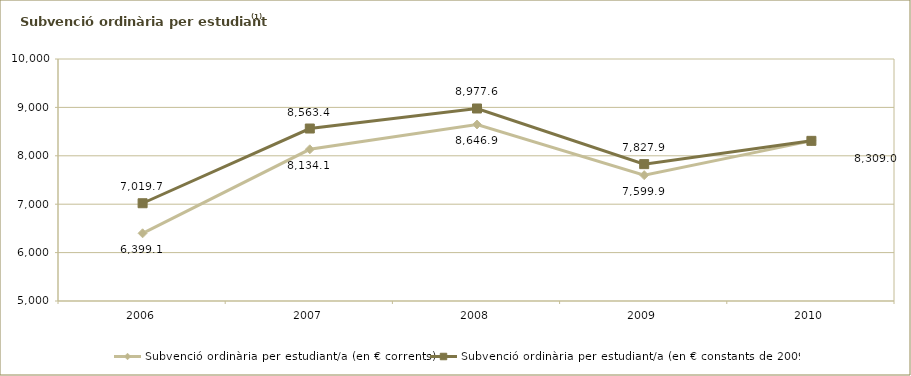
| Category | Subvenció ordinària per estudiant/a (en € corrents) | Subvenció ordinària per estudiant/a (en € constants de 2009) |
|---|---|---|
| 2006.0 | 6399.079 | 7019.738 |
| 2007.0 | 8134.131 | 8563.412 |
| 2008.0 | 8646.895 | 8977.552 |
| 2009.0 | 7599.933 | 7827.931 |
| 2010.0 | 8308.983 | 8308.983 |